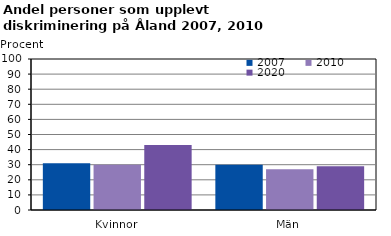
| Category | 2007 | 2010 | 2020 |
|---|---|---|---|
| Kvinnor | 31 | 30 | 43 |
| Män | 30 | 27 | 29 |